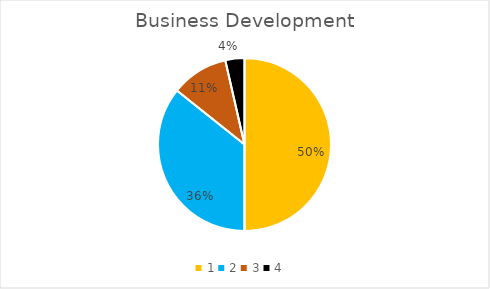
| Category | Series 0 |
|---|---|
| 0 | 0.5 |
| 1 | 0.357 |
| 2 | 0.107 |
| 3 | 0.036 |